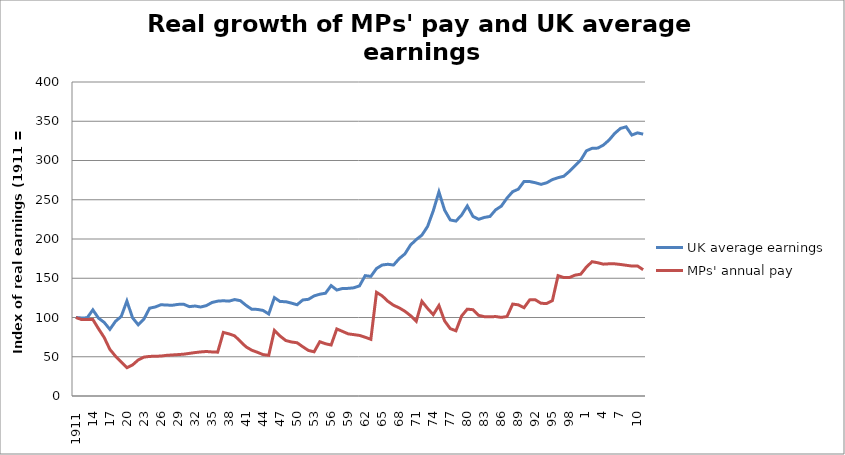
| Category | UK average earnings | MPs' annual pay |
|---|---|---|
| 1911.0 | 100 | 100 |
| 12.0 | 99.412 | 97.413 |
| 13.0 | 99.591 | 97.413 |
| 14.0 | 109.71 | 97.413 |
| 15.0 | 99.143 | 85.652 |
| 16.0 | 93.727 | 74.505 |
| 17.0 | 84.895 | 59.369 |
| 18.0 | 95.222 | 50.647 |
| 19.0 | 101.343 | 43.492 |
| 20.0 | 120.965 | 36.059 |
| 21.0 | 99.584 | 39.572 |
| 22.0 | 90.705 | 45.941 |
| 23.0 | 97.995 | 49.545 |
| 24.0 | 111.882 | 50.412 |
| 25.0 | 113.399 | 50.647 |
| 26.0 | 116.263 | 50.884 |
| 27.0 | 115.855 | 51.799 |
| 28.0 | 115.59 | 52.269 |
| 29.0 | 116.693 | 52.748 |
| 30.0 | 116.924 | 53.264 |
| 31.0 | 113.844 | 54.268 |
| 32.0 | 114.621 | 55.311 |
| 33.0 | 113.367 | 56.135 |
| 34.0 | 115.125 | 56.688 |
| 35.0 | 119.111 | 56.135 |
| 36.0 | 120.839 | 55.847 |
| 37.0 | 121.341 | 80.998 |
| 38.0 | 120.836 | 79.122 |
| 39.0 | 122.845 | 76.644 |
| 40.0 | 121.404 | 69.498 |
| 41.0 | 115.496 | 62.623 |
| 42.0 | 110.549 | 58.343 |
| 43.0 | 110.305 | 55.688 |
| 44.0 | 109.024 | 52.748 |
| 45.0 | 104.478 | 51.799 |
| 46.0 | 125.315 | 83.532 |
| 47.0 | 120.328 | 76.389 |
| 48.0 | 120.133 | 70.696 |
| 49.0 | 118.319 | 68.808 |
| 50.0 | 116.244 | 67.835 |
| 51.0 | 122.326 | 62.756 |
| 52.0 | 123.181 | 58.025 |
| 53.0 | 127.504 | 56.303 |
| 54.0 | 129.669 | 69.154 |
| 55.0 | 130.93 | 66.566 |
| 56.0 | 140.623 | 64.982 |
| 57.0 | 134.995 | 85.406 |
| 58.0 | 136.953 | 82.304 |
| 59.0 | 137.109 | 79.185 |
| 60.0 | 137.833 | 78.173 |
| 61.0 | 140.323 | 77.173 |
| 62.0 | 153.319 | 74.841 |
| 63.0 | 152.369 | 72.228 |
| 64.0 | 162.412 | 132.089 |
| 65.0 | 166.892 | 127.515 |
| 66.0 | 167.808 | 120.685 |
| 67.0 | 166.843 | 115.599 |
| 68.0 | 175.03 | 112.302 |
| 69.0 | 180.989 | 107.973 |
| 70.0 | 192.399 | 102.32 |
| 71.0 | 199.273 | 95.159 |
| 72.0 | 204.929 | 120.58 |
| 73.0 | 215.951 | 111.543 |
| 74.0 | 235.873 | 103.649 |
| 75.0 | 260.031 | 115.287 |
| 76.0 | 236.814 | 95.659 |
| 77.0 | 224.241 | 85.822 |
| 78.0 | 222.807 | 83.04 |
| 79.0 | 230.521 | 101.939 |
| 80.0 | 242.093 | 110.634 |
| 81.0 | 228.814 | 109.935 |
| 82.0 | 225.07 | 102.779 |
| 83.0 | 227.486 | 101.061 |
| 84.0 | 228.72 | 100.858 |
| 85.0 | 237.183 | 101.222 |
| 86.0 | 241.89 | 100.173 |
| 87.0 | 252.136 | 101.227 |
| 88.0 | 260.301 | 117.114 |
| 89.0 | 263.495 | 116.123 |
| 90.0 | 273.261 | 112.476 |
| 91.0 | 273.182 | 122.451 |
| 92.0 | 271.689 | 122.502 |
| 93.0 | 269.624 | 118.064 |
| 94.0 | 271.623 | 117.861 |
| 95.0 | 275.725 | 121.526 |
| 96.0 | 278.123 | 153.343 |
| 97.0 | 279.903 | 150.947 |
| 98.0 | 286.165 | 150.89 |
| 99.0 | 293.442 | 153.98 |
| 2000.0 | 300.483 | 155.186 |
| 1.0 | 312.364 | 164.31 |
| 2.0 | 315.528 | 171.123 |
| 3.0 | 315.803 | 169.718 |
| 4.0 | 319.72 | 167.951 |
| 5.0 | 326.119 | 168.409 |
| 6.0 | 334.633 | 168.359 |
| 7.0 | 340.88 | 167.556 |
| 8.0 | 342.921 | 166.557 |
| 9.0 | 332.404 | 165.528 |
| 10.0 | 335.213 | 165.619 |
| 2011.0 | 333.575 | 160.894 |